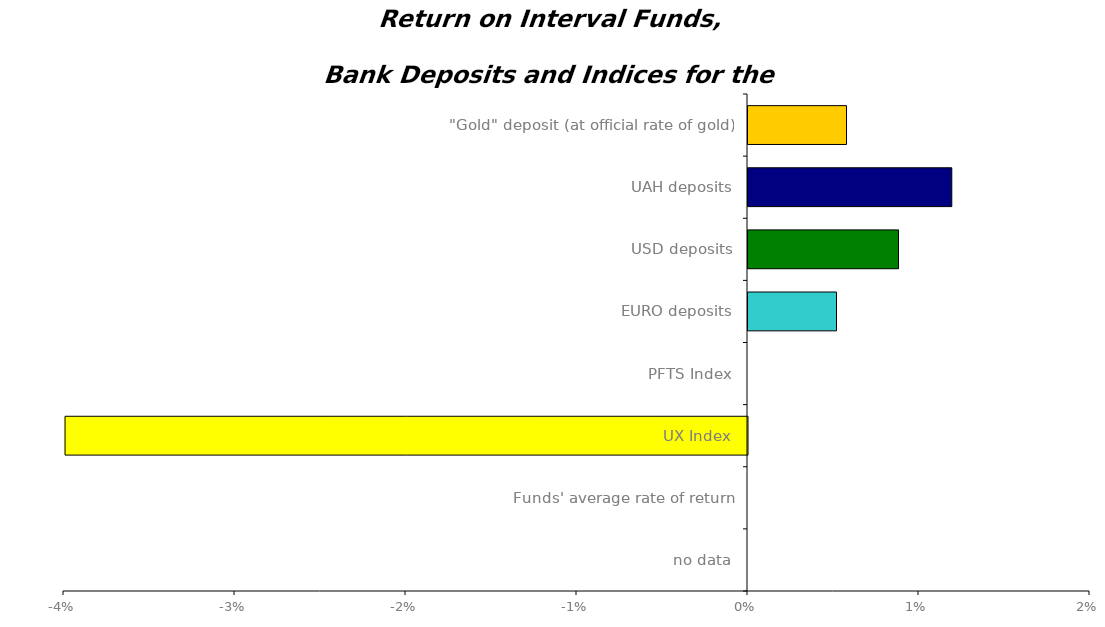
| Category | Series 0 |
|---|---|
| no data | 0 |
| Funds' average rate of return | 0 |
| UX Index | -0.04 |
| PFTS Index | 0 |
| EURO deposits | 0.005 |
| USD deposits | 0.009 |
| UAH deposits | 0.012 |
| "Gold" deposit (at official rate of gold) | 0.006 |